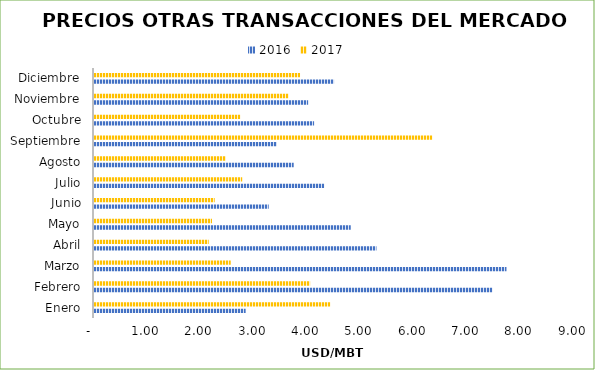
| Category | 2016 | 2017 |
|---|---|---|
| Enero | 2.843 | 4.433 |
| Febrero | 7.471 | 4.053 |
| Marzo | 7.734 | 2.563 |
| Abril | 5.296 | 2.15 |
| Mayo | 4.814 | 2.212 |
| Junio | 3.276 | 2.263 |
| Julio | 4.317 | 2.779 |
| Agosto | 3.744 | 2.475 |
| Septiembre | 3.431 | 6.345 |
| Octubre | 4.127 | 2.744 |
| Noviembre | 4.015 | 3.649 |
| Diciembre | 4.501 | 3.864 |